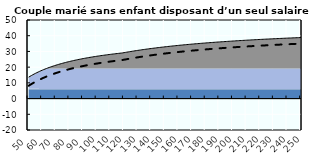
| Category | Coin fiscal moyen (somme des composantes) | Taux moyen d'imposition net en % du salaire brut |
|---|---|---|
| 50.0 | 13.64 | 8.156 |
| 51.0 | 14.161 | 8.71 |
| 52.0 | 14.662 | 9.243 |
| 53.0 | 15.145 | 9.756 |
| 54.0 | 15.609 | 10.25 |
| 55.0 | 16.057 | 10.726 |
| 56.0 | 16.488 | 11.185 |
| 57.0 | 16.905 | 11.628 |
| 58.0 | 17.307 | 12.056 |
| 59.0 | 17.696 | 12.469 |
| 60.0 | 18.071 | 12.869 |
| 61.0 | 18.434 | 13.255 |
| 62.0 | 18.786 | 13.629 |
| 63.0 | 19.126 | 13.991 |
| 64.0 | 19.456 | 14.341 |
| 65.0 | 19.775 | 14.681 |
| 66.0 | 20.085 | 15.011 |
| 67.0 | 20.386 | 15.33 |
| 68.0 | 20.678 | 15.641 |
| 69.0 | 20.961 | 15.942 |
| 70.0 | 21.236 | 16.235 |
| 71.0 | 21.504 | 16.519 |
| 72.0 | 21.764 | 16.796 |
| 73.0 | 22.017 | 17.065 |
| 74.0 | 22.263 | 17.327 |
| 75.0 | 22.502 | 17.581 |
| 76.0 | 22.736 | 17.829 |
| 77.0 | 22.963 | 18.071 |
| 78.0 | 23.184 | 18.306 |
| 79.0 | 23.4 | 18.536 |
| 80.0 | 23.61 | 18.759 |
| 81.0 | 23.815 | 18.978 |
| 82.0 | 24.015 | 19.19 |
| 83.0 | 24.211 | 19.398 |
| 84.0 | 24.401 | 19.601 |
| 85.0 | 24.588 | 19.799 |
| 86.0 | 24.77 | 19.992 |
| 87.0 | 24.947 | 20.181 |
| 88.0 | 25.121 | 20.366 |
| 89.0 | 25.291 | 20.547 |
| 90.0 | 25.457 | 20.723 |
| 91.0 | 25.619 | 20.896 |
| 92.0 | 25.778 | 21.065 |
| 93.0 | 25.933 | 21.23 |
| 94.0 | 26.085 | 21.392 |
| 95.0 | 26.234 | 21.55 |
| 96.0 | 26.38 | 21.705 |
| 97.0 | 26.523 | 21.857 |
| 98.0 | 26.662 | 22.005 |
| 99.0 | 26.799 | 22.151 |
| 100.0 | 26.934 | 22.294 |
| 101.0 | 27.065 | 22.434 |
| 102.0 | 27.194 | 22.571 |
| 103.0 | 27.321 | 22.706 |
| 104.0 | 27.445 | 22.838 |
| 105.0 | 27.567 | 22.967 |
| 106.0 | 27.686 | 23.094 |
| 107.0 | 27.803 | 23.219 |
| 108.0 | 27.918 | 23.341 |
| 109.0 | 28.031 | 23.461 |
| 110.0 | 28.142 | 23.579 |
| 111.0 | 28.251 | 23.695 |
| 112.0 | 28.358 | 23.809 |
| 113.0 | 28.463 | 23.92 |
| 114.0 | 28.566 | 24.03 |
| 115.0 | 28.668 | 24.138 |
| 116.0 | 28.767 | 24.244 |
| 117.0 | 28.865 | 24.348 |
| 118.0 | 28.962 | 24.451 |
| 119.0 | 29.08 | 24.576 |
| 120.0 | 29.235 | 24.741 |
| 121.0 | 29.388 | 24.904 |
| 122.0 | 29.538 | 25.064 |
| 123.0 | 29.686 | 25.221 |
| 124.0 | 29.831 | 25.375 |
| 125.0 | 29.974 | 25.528 |
| 126.0 | 30.115 | 25.677 |
| 127.0 | 30.254 | 25.825 |
| 128.0 | 30.39 | 25.97 |
| 129.0 | 30.525 | 26.113 |
| 130.0 | 30.657 | 26.254 |
| 131.0 | 30.787 | 26.392 |
| 132.0 | 30.915 | 26.528 |
| 133.0 | 31.042 | 26.663 |
| 134.0 | 31.166 | 26.795 |
| 135.0 | 31.289 | 26.926 |
| 136.0 | 31.41 | 27.054 |
| 137.0 | 31.529 | 27.181 |
| 138.0 | 31.646 | 27.305 |
| 139.0 | 31.762 | 27.428 |
| 140.0 | 31.876 | 27.55 |
| 141.0 | 31.988 | 27.669 |
| 142.0 | 32.099 | 27.787 |
| 143.0 | 32.208 | 27.903 |
| 144.0 | 32.316 | 28.018 |
| 145.0 | 32.422 | 28.131 |
| 146.0 | 32.527 | 28.242 |
| 147.0 | 32.63 | 28.352 |
| 148.0 | 32.732 | 28.461 |
| 149.0 | 32.833 | 28.567 |
| 150.0 | 32.932 | 28.673 |
| 151.0 | 33.03 | 28.777 |
| 152.0 | 33.126 | 28.88 |
| 153.0 | 33.222 | 28.981 |
| 154.0 | 33.316 | 29.082 |
| 155.0 | 33.409 | 29.18 |
| 156.0 | 33.501 | 29.278 |
| 157.0 | 33.591 | 29.374 |
| 158.0 | 33.681 | 29.469 |
| 159.0 | 33.769 | 29.563 |
| 160.0 | 33.856 | 29.656 |
| 161.0 | 33.942 | 29.748 |
| 162.0 | 34.027 | 29.838 |
| 163.0 | 34.111 | 29.927 |
| 164.0 | 34.194 | 30.016 |
| 165.0 | 34.276 | 30.103 |
| 166.0 | 34.357 | 30.189 |
| 167.0 | 34.437 | 30.274 |
| 168.0 | 34.516 | 30.358 |
| 169.0 | 34.594 | 30.441 |
| 170.0 | 34.672 | 30.523 |
| 171.0 | 34.748 | 30.604 |
| 172.0 | 34.823 | 30.685 |
| 173.0 | 34.898 | 30.764 |
| 174.0 | 34.972 | 30.842 |
| 175.0 | 35.044 | 30.92 |
| 176.0 | 35.116 | 30.996 |
| 177.0 | 35.188 | 31.072 |
| 178.0 | 35.258 | 31.147 |
| 179.0 | 35.328 | 31.221 |
| 180.0 | 35.397 | 31.294 |
| 181.0 | 35.465 | 31.367 |
| 182.0 | 35.532 | 31.438 |
| 183.0 | 35.599 | 31.509 |
| 184.0 | 35.664 | 31.579 |
| 185.0 | 35.73 | 31.648 |
| 186.0 | 35.794 | 31.717 |
| 187.0 | 35.858 | 31.785 |
| 188.0 | 35.921 | 31.852 |
| 189.0 | 35.983 | 31.918 |
| 190.0 | 36.045 | 31.984 |
| 191.0 | 36.106 | 32.049 |
| 192.0 | 36.167 | 32.113 |
| 193.0 | 36.227 | 32.177 |
| 194.0 | 36.286 | 32.24 |
| 195.0 | 36.344 | 32.302 |
| 196.0 | 36.403 | 32.364 |
| 197.0 | 36.46 | 32.425 |
| 198.0 | 36.517 | 32.486 |
| 199.0 | 36.573 | 32.546 |
| 200.0 | 36.629 | 32.605 |
| 201.0 | 36.684 | 32.663 |
| 202.0 | 36.739 | 32.722 |
| 203.0 | 36.793 | 32.779 |
| 204.0 | 36.846 | 32.836 |
| 205.0 | 36.899 | 32.892 |
| 206.0 | 36.952 | 32.948 |
| 207.0 | 37.004 | 33.004 |
| 208.0 | 37.055 | 33.058 |
| 209.0 | 37.106 | 33.113 |
| 210.0 | 37.157 | 33.166 |
| 211.0 | 37.207 | 33.22 |
| 212.0 | 37.257 | 33.272 |
| 213.0 | 37.306 | 33.325 |
| 214.0 | 37.354 | 33.376 |
| 215.0 | 37.403 | 33.428 |
| 216.0 | 37.45 | 33.479 |
| 217.0 | 37.498 | 33.529 |
| 218.0 | 37.545 | 33.579 |
| 219.0 | 37.591 | 33.628 |
| 220.0 | 37.637 | 33.677 |
| 221.0 | 37.683 | 33.726 |
| 222.0 | 37.728 | 33.774 |
| 223.0 | 37.773 | 33.821 |
| 224.0 | 37.817 | 33.869 |
| 225.0 | 37.861 | 33.915 |
| 226.0 | 37.905 | 33.962 |
| 227.0 | 37.948 | 34.008 |
| 228.0 | 37.991 | 34.053 |
| 229.0 | 38.033 | 34.098 |
| 230.0 | 38.075 | 34.143 |
| 231.0 | 38.117 | 34.188 |
| 232.0 | 38.159 | 34.232 |
| 233.0 | 38.2 | 34.275 |
| 234.0 | 38.24 | 34.319 |
| 235.0 | 38.281 | 34.362 |
| 236.0 | 38.321 | 34.404 |
| 237.0 | 38.36 | 34.446 |
| 238.0 | 38.4 | 34.488 |
| 239.0 | 38.439 | 34.53 |
| 240.0 | 38.477 | 34.571 |
| 241.0 | 38.516 | 34.611 |
| 242.0 | 38.554 | 34.652 |
| 243.0 | 38.591 | 34.692 |
| 244.0 | 38.629 | 34.732 |
| 245.0 | 38.666 | 34.771 |
| 246.0 | 38.703 | 34.81 |
| 247.0 | 38.739 | 34.849 |
| 248.0 | 38.775 | 34.888 |
| 249.0 | 38.811 | 34.926 |
| 250.0 | 38.847 | 34.964 |